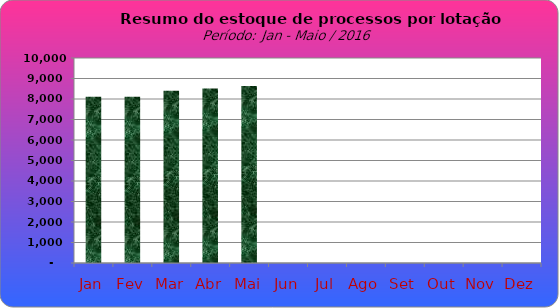
| Category | Series 0 |
|---|---|
| Jan | 8111 |
| Fev | 8114 |
| Mar | 8403 |
| Abr | 8512 |
| Mai | 8632 |
| Jun | 0 |
| Jul | 0 |
| Ago | 0 |
| Set | 0 |
| Out | 0 |
| Nov | 0 |
| Dez | 0 |